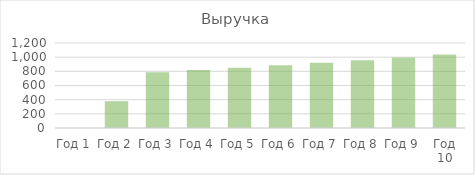
| Category | Выручка |
|---|---|
| Год 1 | 0 |
| Год 2 | 378.56 |
| Год 3 | 787.405 |
| Год 4 | 818.901 |
| Год 5 | 851.657 |
| Год 6 | 885.723 |
| Год 7 | 921.152 |
| Год 8 | 957.998 |
| Год 9 | 996.318 |
| Год 10 | 1036.171 |